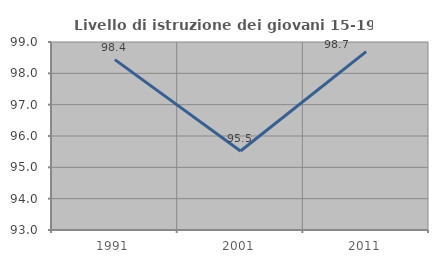
| Category | Livello di istruzione dei giovani 15-19 anni |
|---|---|
| 1991.0 | 98.438 |
| 2001.0 | 95.522 |
| 2011.0 | 98.693 |